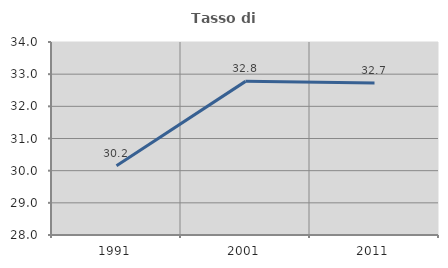
| Category | Tasso di occupazione   |
|---|---|
| 1991.0 | 30.152 |
| 2001.0 | 32.776 |
| 2011.0 | 32.727 |